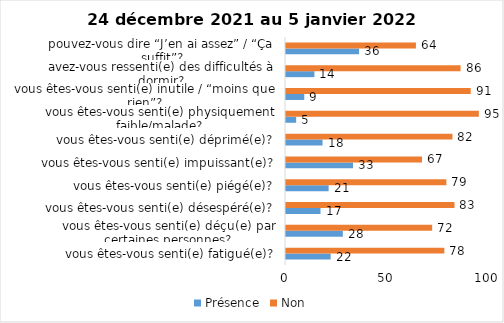
| Category | Présence | Non |
|---|---|---|
| vous êtes-vous senti(e) fatigué(e)? | 22 | 78 |
| vous êtes-vous senti(e) déçu(e) par certaines personnes? | 28 | 72 |
| vous êtes-vous senti(e) désespéré(e)? | 17 | 83 |
| vous êtes-vous senti(e) piégé(e)? | 21 | 79 |
| vous êtes-vous senti(e) impuissant(e)? | 33 | 67 |
| vous êtes-vous senti(e) déprimé(e)? | 18 | 82 |
| vous êtes-vous senti(e) physiquement faible/malade? | 5 | 95 |
| vous êtes-vous senti(e) inutile / “moins que rien”? | 9 | 91 |
| avez-vous ressenti(e) des difficultés à dormir? | 14 | 86 |
| pouvez-vous dire “J’en ai assez” / “Ça suffit”? | 36 | 64 |